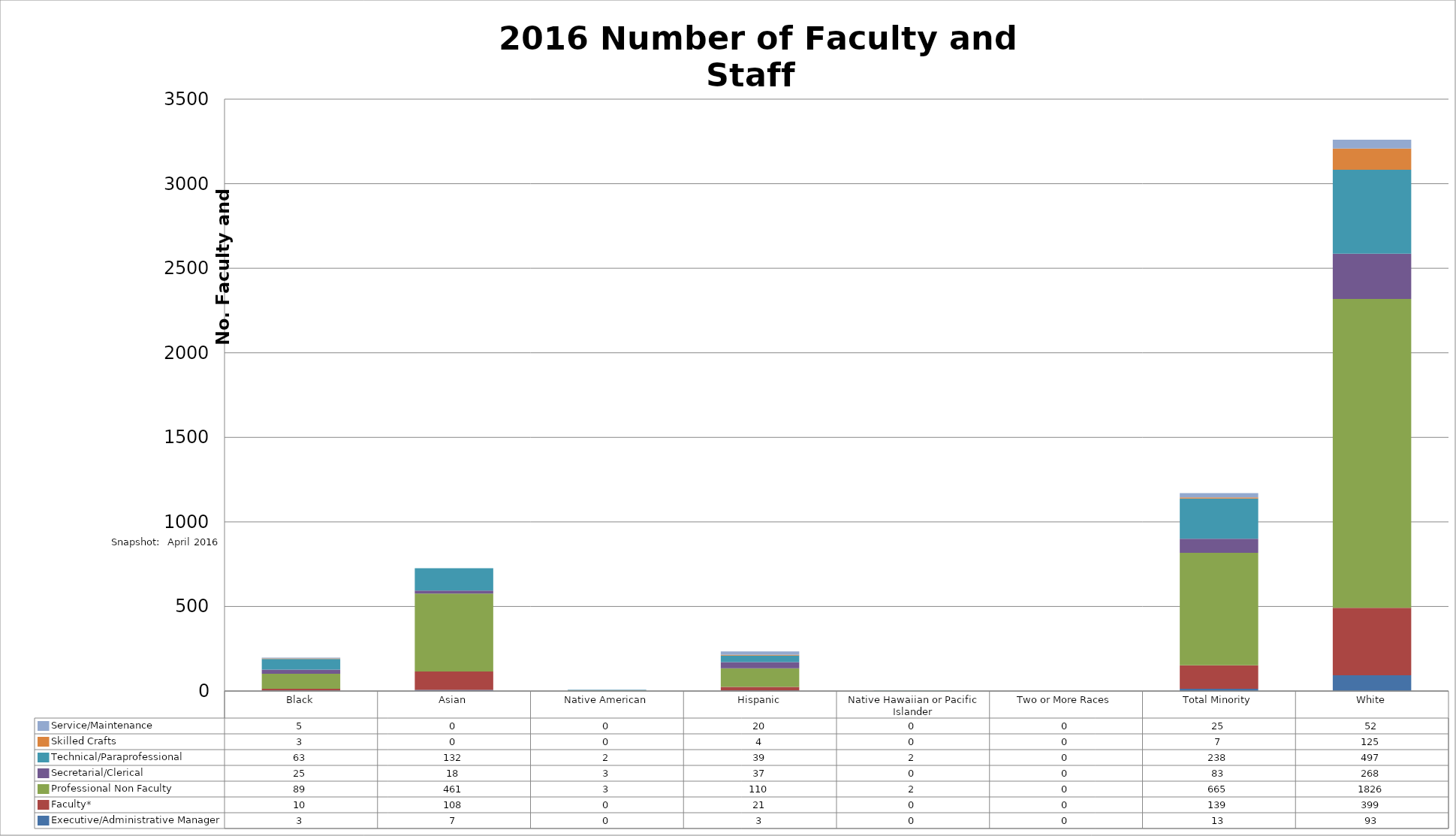
| Category | Executive/Administrative Manager | Faculty* | Professional Non Faculty | Secretarial/Clerical | Technical/Paraprofessional | Skilled Crafts | Service/Maintenance |
|---|---|---|---|---|---|---|---|
| Black | 3 | 10 | 89 | 25 | 63 | 3 | 5 |
| Asian | 7 | 108 | 461 | 18 | 132 | 0 | 0 |
| Native American | 0 | 0 | 3 | 3 | 2 | 0 | 0 |
| Hispanic | 3 | 21 | 110 | 37 | 39 | 4 | 20 |
| Native Hawaiian or Pacific Islander | 0 | 0 | 2 | 0 | 2 | 0 | 0 |
| Two or More Races | 0 | 0 | 0 | 0 | 0 | 0 | 0 |
| Total Minority | 13 | 139 | 665 | 83 | 238 | 7 | 25 |
| White | 93 | 399 | 1826 | 268 | 497 | 125 | 52 |